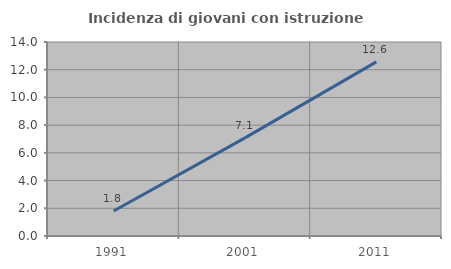
| Category | Incidenza di giovani con istruzione universitaria |
|---|---|
| 1991.0 | 1.802 |
| 2001.0 | 7.08 |
| 2011.0 | 12.568 |